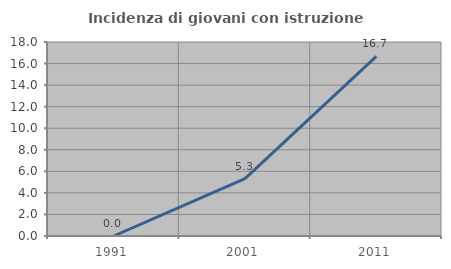
| Category | Incidenza di giovani con istruzione universitaria |
|---|---|
| 1991.0 | 0 |
| 2001.0 | 5.319 |
| 2011.0 | 16.667 |